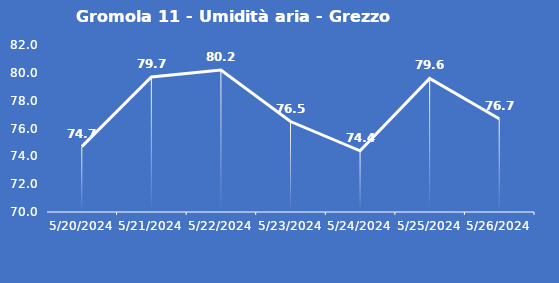
| Category | Gromola 11 - Umidità aria - Grezzo (%) |
|---|---|
| 5/20/24 | 74.7 |
| 5/21/24 | 79.7 |
| 5/22/24 | 80.2 |
| 5/23/24 | 76.5 |
| 5/24/24 | 74.4 |
| 5/25/24 | 79.6 |
| 5/26/24 | 76.7 |